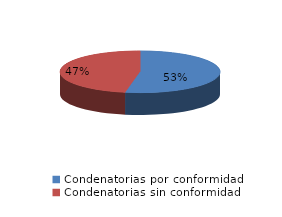
| Category | Series 0 |
|---|---|
| 0 | 27 |
| 1 | 24 |